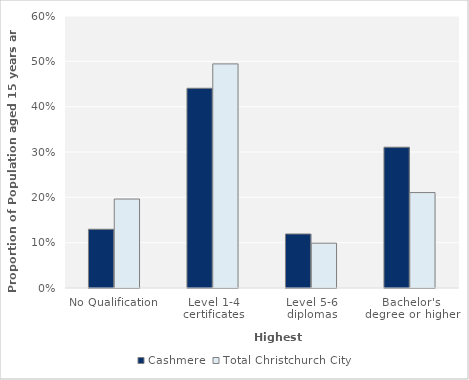
| Category | Cashmere | Total Christchurch City |
|---|---|---|
| No Qualification | 0.13 | 0.196 |
| Level 1-4 certificates | 0.441 | 0.494 |
| Level 5-6 diplomas | 0.119 | 0.099 |
| Bachelor's degree or higher | 0.311 | 0.211 |